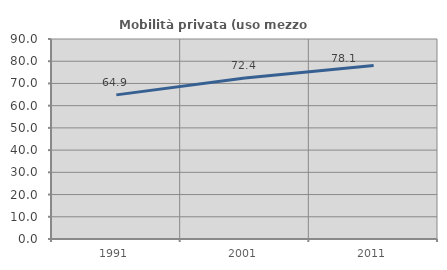
| Category | Mobilità privata (uso mezzo privato) |
|---|---|
| 1991.0 | 64.861 |
| 2001.0 | 72.406 |
| 2011.0 | 78.086 |